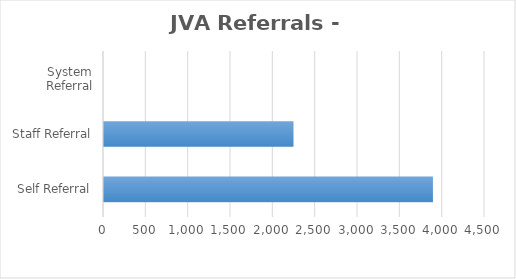
| Category | Series 0 |
|---|---|
| Self Referral | 3885 |
| Staff Referral | 2238 |
| System Referral | 0 |